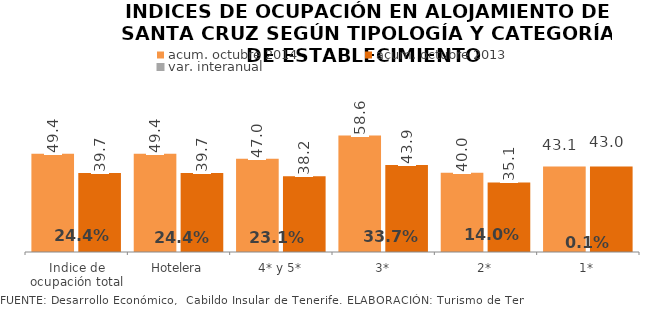
| Category | acum. octubre 2014 | acum. octubre 2013 |
|---|---|---|
| Indice de ocupación total | 49.424 | 39.743 |
| Hotelera | 49.424 | 39.743 |
| 4* y 5* | 47.015 | 38.205 |
| 3* | 58.642 | 43.864 |
| 2* | 39.97 | 35.061 |
| 1* | 43.063 | 43.019 |